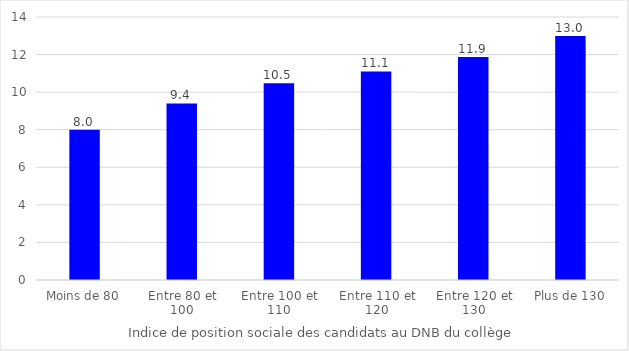
| Category | Note aux épreuves écrites (sur 20) |
|---|---|
| Moins de 80 | 8.001 |
| Entre 80 et 100 | 9.398 |
| Entre 100 et 110 | 10.474 |
| Entre 110 et 120 | 11.099 |
| Entre 120 et 130 | 11.864 |
| Plus de 130 | 12.983 |